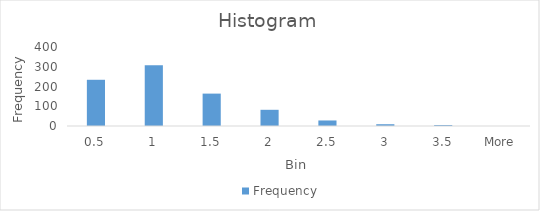
| Category | Frequency |
|---|---|
| 0.5 | 234 |
| 1 | 307 |
| 1.5 | 164 |
| 2 | 82 |
| 2.5 | 28 |
| 3 | 9 |
| 3.5 | 5 |
| More | 0 |